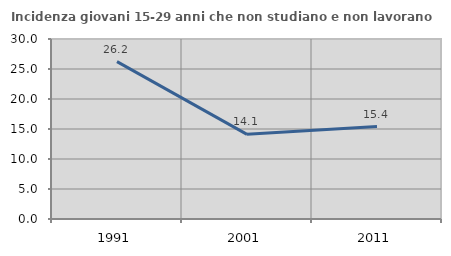
| Category | Incidenza giovani 15-29 anni che non studiano e non lavorano  |
|---|---|
| 1991.0 | 26.23 |
| 2001.0 | 14.112 |
| 2011.0 | 15.413 |